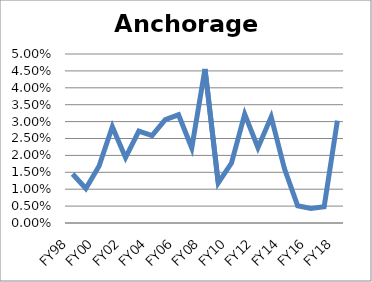
| Category | Anchorage CPI |
|---|---|
| FY98 | 0.015 |
| FY99 | 0.01 |
| FY00 | 0.017 |
| FY01 | 0.028 |
| FY02 | 0.019 |
| FY03 | 0.027 |
| FY04 | 0.026 |
| FY05 | 0.031 |
| FY06 | 0.032 |
| FY07 | 0.022 |
| FY08 | 0.046 |
| FY09 | 0.012 |
| FY10 | 0.018 |
| FY11 | 0.032 |
| FY12 | 0.022 |
| FY13 | 0.031 |
| FY14 | 0.016 |
| FY15 | 0.005 |
| FY16 | 0.004 |
| FY17 | 0.005 |
| FY18 | 0.03 |